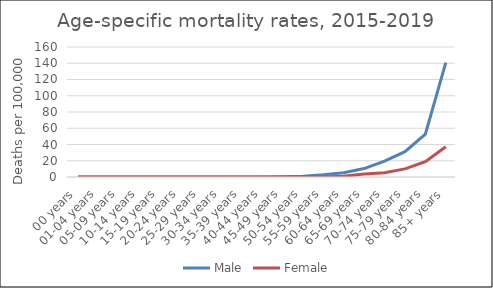
| Category | Male | Female |
|---|---|---|
| 00 years | 0 | 0 |
| 01-04 years | 0 | 0 |
| 05-09 years | 0 | 0 |
| 10-14 years | 0 | 0 |
| 15-19 years | 0 | 0 |
| 20-24 years | 0 | 0 |
| 25-29 years | 0 | 0 |
| 30-34 years | 0 | 0 |
| 35-39 years | 0 | 0 |
| 40-44 years | 0 | 0 |
| 45-49 years | 0.39 | 0 |
| 50-54 years | 0.96 | 0.41 |
| 55-59 years | 2.75 | 0 |
| 60-64 years | 5.12 | 0.91 |
| 65-69 years | 10.4 | 3.61 |
| 70-74 years | 19.51 | 5.24 |
| 75-79 years | 31.18 | 10.02 |
| 80-84 years | 52.61 | 18.73 |
| 85+ years | 140.69 | 37.3 |